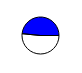
| Category | Series 0 |
|---|---|
| 0 | 35614 |
| 1 | 33428 |